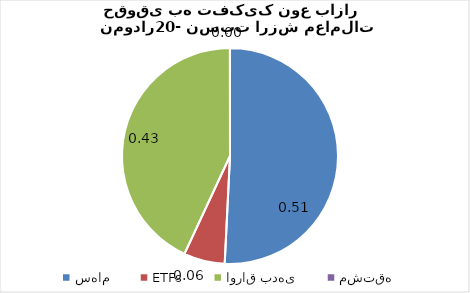
| Category | Series 0 |
|---|---|
| سهام | 0.508 |
| ETFs | 0.061 |
| اوراق بدهی | 0.431 |
| مشتقه | 0 |